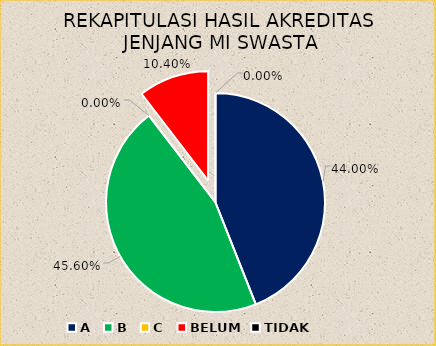
| Category | REKAPITULASI HASIL AKREDITASI JENJANG MI SWASTA |
|---|---|
| A | 55 |
| B | 57 |
| C | 0 |
| BELUM | 13 |
| TIDAK | 0 |